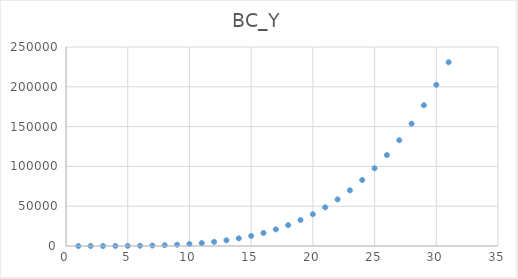
| Category | BC_Y |
|---|---|
| 1.0 | 0 |
| 2.0 | 3.75 |
| 3.0 | 20 |
| 4.0 | 63.75 |
| 5.0 | 156 |
| 6.0 | 323.75 |
| 7.0 | 600 |
| 8.0 | 1023.75 |
| 9.0 | 1640 |
| 10.0 | 2499.75 |
| 11.0 | 3660 |
| 12.0 | 5183.75 |
| 13.0 | 7140 |
| 14.0 | 9603.75 |
| 15.0 | 12656 |
| 16.0 | 16383.75 |
| 17.0 | 20880 |
| 18.0 | 26243.75 |
| 19.0 | 32580 |
| 20.0 | 39999.75 |
| 21.0 | 48620 |
| 22.0 | 58563.75 |
| 23.0 | 69960 |
| 24.0 | 82943.75 |
| 25.0 | 97656 |
| 26.0 | 114243.75 |
| 27.0 | 132860 |
| 28.0 | 153663.75 |
| 29.0 | 176820 |
| 30.0 | 202499.75 |
| 31.0 | 230880 |